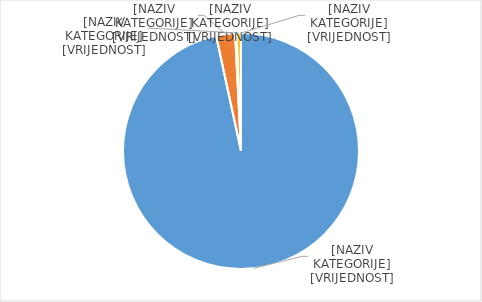
| Category | Series 0 |
|---|---|
| Poslani kreditni transferi  | 0.966 |
| Trajni nalozi   | 0.026 |
| Usluga plaćanja računa  | 0.002 |
| Izravna terećenja  | 0.006 |
| Poslane novčane pošiljke  | 0 |